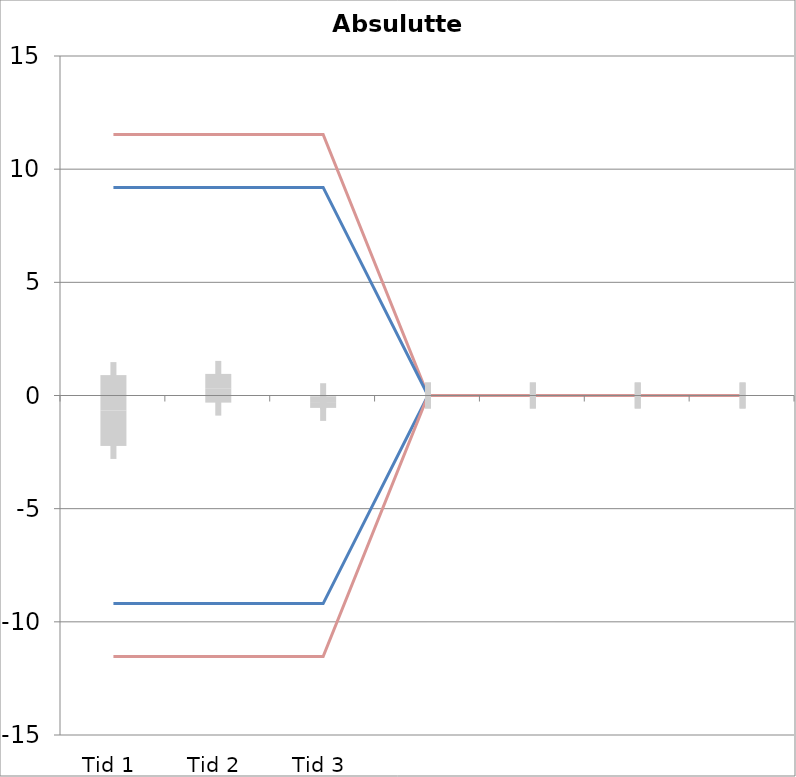
| Category | 1 | 2 | 3 | 4 | 5 | 6 | 7 | 8 | 9 | 10 | 11 | 12 | 13 | 14 | 15 | 16 | 17 | 18 | 19 | 20 | TEa | B | -B | -TEa | M |
|---|---|---|---|---|---|---|---|---|---|---|---|---|---|---|---|---|---|---|---|---|---|---|---|---|---|
| Tid 1 | 0.8 | -0.2 | -0.2 | 0 | -0.3 | -0.5 | -7.6 | -0.1 | 0.1 | 0.4 | 0.3 | 0 | 0 | 0 | 0 | 0 | 0 | 0 | 0 | 0 | 11.537 | 9.195 | -9.195 | -11.537 | -0.664 |
| Tid 2 | -0.4 | 0.5 | -0.1 | 0 | -0.1 | 0 | 2.4 | 0.2 | -0.3 | -0.3 | 1.3 | 0 | 0 | 0 | 0 | 0 | 0 | 0 | 0 | 0 | 11.537 | 9.195 | -9.195 | -11.537 | 0.32 |
| Tid 3 | -0.5 | -0.2 | -0.4 | 0 | -0.2 | -0.2 | -1.2 | -0.2 | 0 | 0 | 0 | 0 | 0 | 0 | 0 | 0 | 0 | 0 | 0 | 0 | 11.537 | 9.195 | -9.195 | -11.537 | -0.29 |